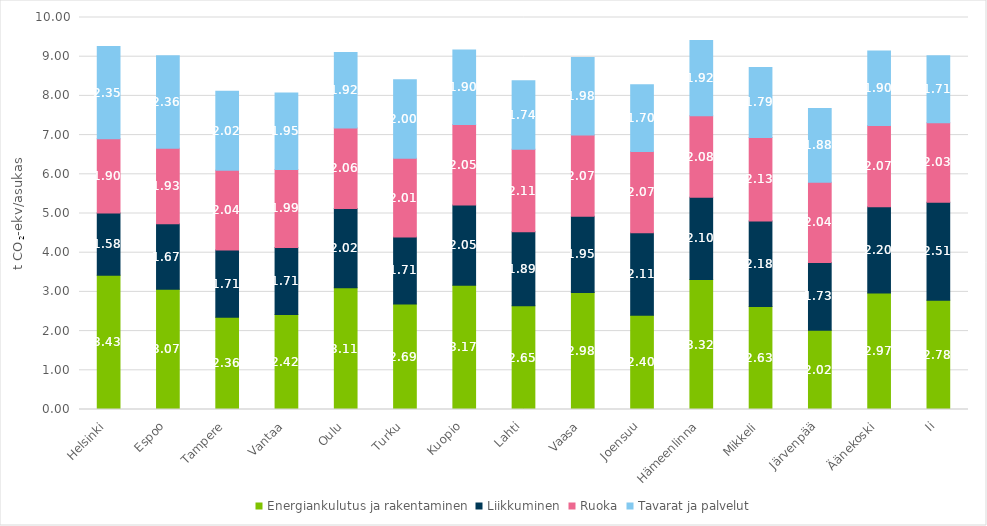
| Category | Energiankulutus ja rakentaminen | Liikkuminen | Ruoka | Tavarat ja palvelut |
|---|---|---|---|---|
| Helsinki | 3.427 | 1.583 | 1.896 | 2.354 |
| Espoo | 3.066 | 1.671 | 1.929 | 2.357 |
| Tampere | 2.356 | 1.712 | 2.038 | 2.016 |
| Vantaa | 2.424 | 1.711 | 1.989 | 1.948 |
| Oulu | 3.108 | 2.02 | 2.056 | 1.923 |
| Turku | 2.692 | 1.71 | 2.009 | 2.003 |
| Kuopio | 3.172 | 2.046 | 2.052 | 1.904 |
| Lahti | 2.645 | 1.888 | 2.108 | 1.744 |
| Vaasa | 2.985 | 1.945 | 2.071 | 1.977 |
| Joensuu | 2.403 | 2.108 | 2.074 | 1.701 |
| Hämeenlinna | 3.315 | 2.099 | 2.079 | 1.92 |
| Mikkeli | 2.629 | 2.178 | 2.131 | 1.79 |
| Järvenpää | 2.02 | 1.732 | 2.044 | 1.88 |
| Äänekoski | 2.971 | 2.201 | 2.074 | 1.9 |
| Ii | 2.784 | 2.505 | 2.029 | 1.708 |